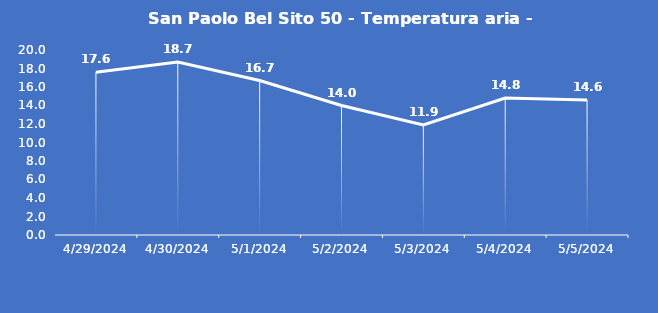
| Category | San Paolo Bel Sito 50 - Temperatura aria - Grezzo (°C) |
|---|---|
| 4/29/24 | 17.6 |
| 4/30/24 | 18.7 |
| 5/1/24 | 16.7 |
| 5/2/24 | 14 |
| 5/3/24 | 11.9 |
| 5/4/24 | 14.8 |
| 5/5/24 | 14.6 |